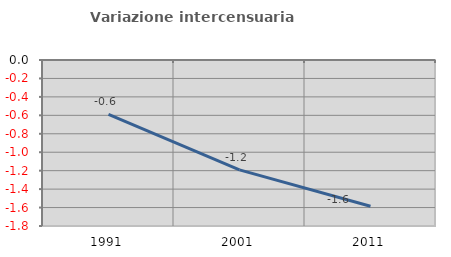
| Category | Variazione intercensuaria annua |
|---|---|
| 1991.0 | -0.59 |
| 2001.0 | -1.191 |
| 2011.0 | -1.586 |